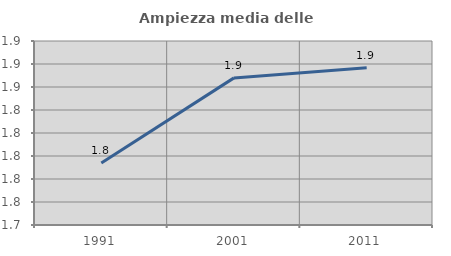
| Category | Ampiezza media delle famiglie |
|---|---|
| 1991.0 | 1.794 |
| 2001.0 | 1.868 |
| 2011.0 | 1.877 |